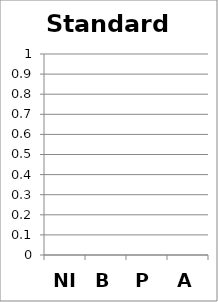
| Category | Standard 6 |
|---|---|
| NI | 0 |
| B | 0 |
| P | 0 |
| A | 0 |